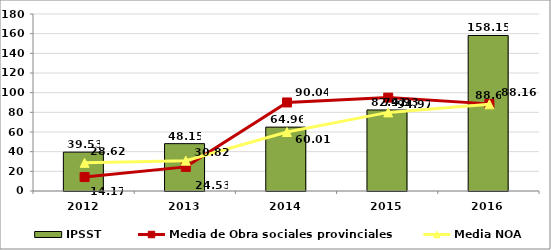
| Category | IPSST |
|---|---|
| 2012.0 | 39.53 |
| 2013.0 | 48.15 |
| 2014.0 | 64.96 |
| 2015.0 | 82.41 |
| 2016.0 | 158.15 |